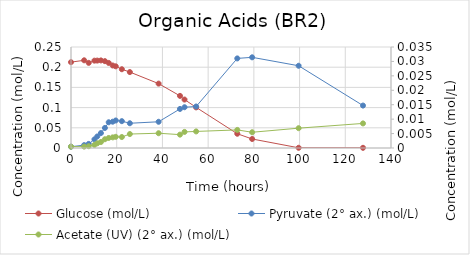
| Category | Glucose (mol/L) |
|---|---|
| 0.0 | 0.212 |
| 5.750000000058208 | 0.217 |
| 7.749999999941792 | 0.211 |
| 10.250000000058208 | 0.216 |
| 11.499999999941792 | 0.216 |
| 13.083333333372138 | 0.217 |
| 14.83333333331393 | 0.215 |
| 16.5 | 0.211 |
| 18.249999999941792 | 0.204 |
| 19.583333333255723 | 0.202 |
| 22.250000000058208 | 0.195 |
| 25.749999999941792 | 0.188 |
| 38.33333333325572 | 0.159 |
| 47.683333333348855 | 0.129 |
| 49.66666666668607 | 0.12 |
| 54.75 | 0.101 |
| 72.75 | 0.035 |
| 79.25000000005821 | 0.022 |
| 99.58333333331393 | 0.001 |
| 127.74999999994179 | 0 |